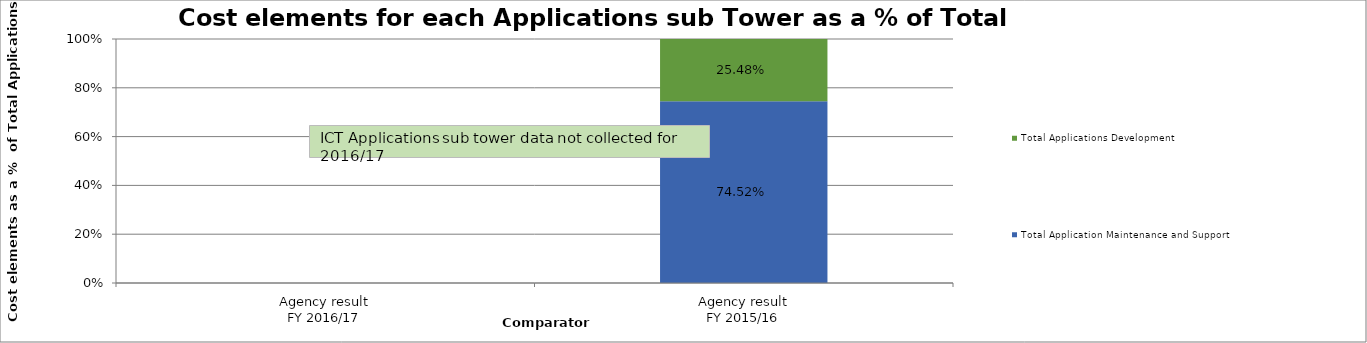
| Category | Total Application Maintenance and Support | Total Applications Development |
|---|---|---|
| Agency result
FY 2016/17 | 0 | 0 |
| Agency result
FY 2015/16 | 0.745 | 0.255 |